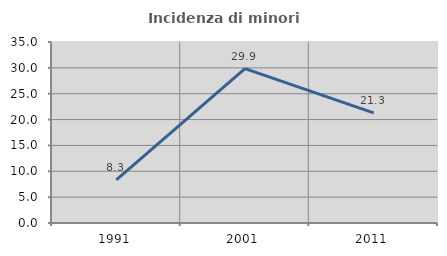
| Category | Incidenza di minori stranieri |
|---|---|
| 1991.0 | 8.333 |
| 2001.0 | 29.851 |
| 2011.0 | 21.293 |